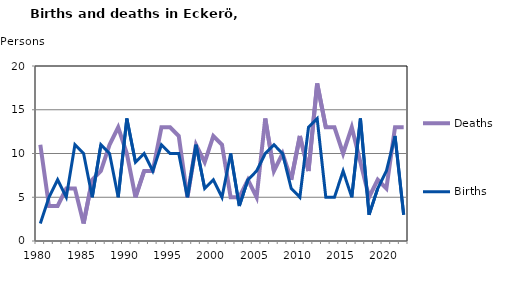
| Category | Deaths | Births |
|---|---|---|
| 1980.0 | 11 | 2 |
| 1981.0 | 4 | 5 |
| 1982.0 | 4 | 7 |
| 1983.0 | 6 | 5 |
| 1984.0 | 6 | 11 |
| 1985.0 | 2 | 10 |
| 1986.0 | 7 | 5 |
| 1987.0 | 8 | 11 |
| 1988.0 | 11 | 10 |
| 1989.0 | 13 | 5 |
| 1990.0 | 10 | 14 |
| 1991.0 | 5 | 9 |
| 1992.0 | 8 | 10 |
| 1993.0 | 8 | 8 |
| 1994.0 | 13 | 11 |
| 1995.0 | 13 | 10 |
| 1996.0 | 12 | 10 |
| 1997.0 | 5 | 5 |
| 1998.0 | 11 | 11 |
| 1999.0 | 9 | 6 |
| 2000.0 | 12 | 7 |
| 2001.0 | 11 | 5 |
| 2002.0 | 5 | 10 |
| 2003.0 | 5 | 4 |
| 2004.0 | 7 | 7 |
| 2005.0 | 5 | 8 |
| 2006.0 | 14 | 10 |
| 2007.0 | 8 | 11 |
| 2008.0 | 10 | 10 |
| 2009.0 | 7 | 6 |
| 2010.0 | 12 | 5 |
| 2011.0 | 8 | 13 |
| 2012.0 | 18 | 14 |
| 2013.0 | 13 | 5 |
| 2014.0 | 13 | 5 |
| 2015.0 | 10 | 8 |
| 2016.0 | 13 | 5 |
| 2017.0 | 9 | 14 |
| 2018.0 | 5 | 3 |
| 2019.0 | 7 | 6 |
| 2020.0 | 6 | 8 |
| 2021.0 | 13 | 12 |
| 2022.0 | 13 | 3 |